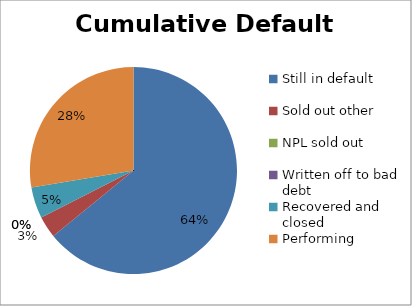
| Category | Cumulative Default Breakdown |
|---|---|
| Still in default | 0.641 |
| Sold out other | 0.034 |
| NPL sold out | 0 |
| Written off to bad debt | 0 |
| Recovered and closed | 0.049 |
| Performing | 0.276 |